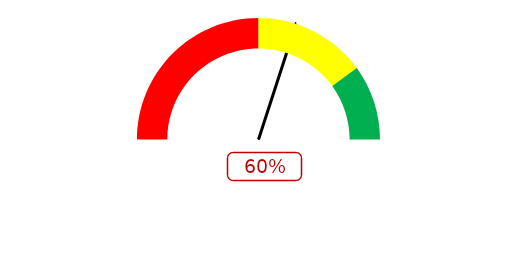
| Category | Стрелка |
|---|---|
| 0 | 0.6 |
| 1 | 0 |
| 2 | 1.4 |